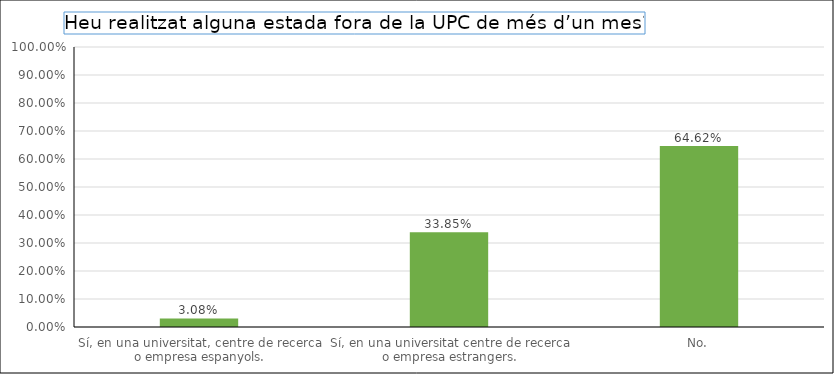
| Category | Series 0 |
|---|---|
| Sí, en una universitat, centre de recerca o empresa espanyols. | 0.031 |
| Sí, en una universitat centre de recerca o empresa estrangers. | 0.338 |
| No. | 0.646 |